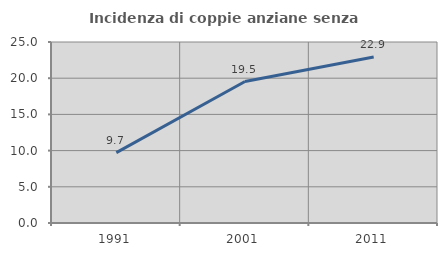
| Category | Incidenza di coppie anziane senza figli  |
|---|---|
| 1991.0 | 9.728 |
| 2001.0 | 19.543 |
| 2011.0 | 22.93 |